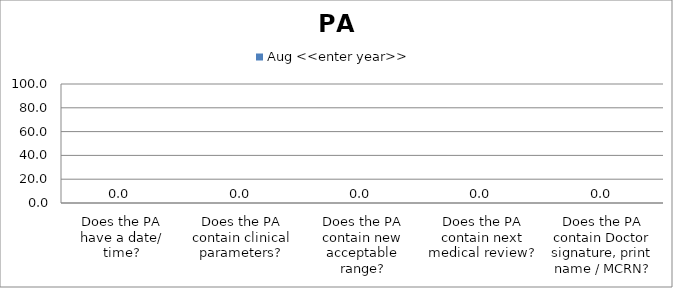
| Category | Aug <<enter year>> |
|---|---|
| Does the PA have a date/ time? | 0 |
| Does the PA contain clinical parameters? | 0 |
| Does the PA contain new acceptable range? | 0 |
| Does the PA contain next medical review? | 0 |
| Does the PA contain Doctor signature, print name / MCRN? | 0 |